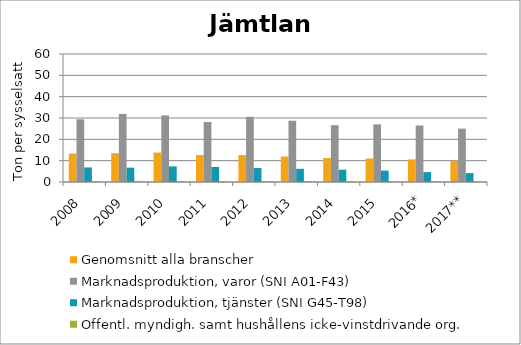
| Category | Genomsnitt alla branscher | Marknadsproduktion, varor (SNI A01-F43) | Marknadsproduktion, tjänster (SNI G45-T98) | Offentl. myndigh. samt hushållens icke-vinstdrivande org. |
|---|---|---|---|---|
| 2008 | 13.314 | 29.389 | 6.825 | 0.47 |
| 2009 | 13.502 | 31.898 | 6.724 | 0.502 |
| 2010 | 13.808 | 31.226 | 7.343 | 0.478 |
| 2011 | 12.67 | 28.176 | 7.034 | 0.441 |
| 2012 | 12.61 | 30.562 | 6.545 | 0.406 |
| 2013 | 11.96 | 28.726 | 6.198 | 0.381 |
| 2014 | 11.229 | 26.622 | 5.767 | 0.381 |
| 2015 | 11.026 | 27.006 | 5.342 | 0.367 |
| 2016* | 10.6 | 26.486 | 4.651 | 0.357 |
| 2017** | 9.914 | 25.016 | 4.183 | 0.355 |